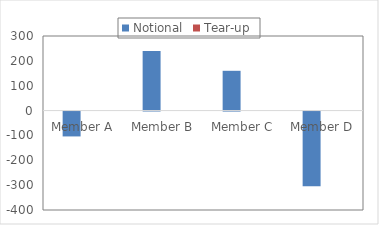
| Category | Notional | Tear-up |
|---|---|---|
| Member A | -100 | 0 |
| Member B | 240 | 0 |
| Member C | 160 | 0 |
| Member D | -300 | 0 |